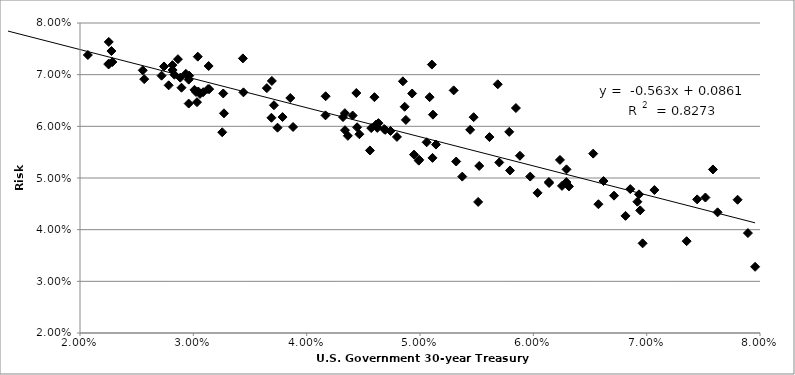
| Category | Series 0 |
|---|---|
| 0.07802062499999997 | 0.046 |
| 0.07893437499999999 | 0.039 |
| 0.07445446153846155 | 0.046 |
| 0.07518469696969694 | 0.046 |
| 0.07068396825396826 | 0.048 |
| 0.06855323076923074 | 0.048 |
| 0.06314272727272731 | 0.048 |
| 0.061389999999999986 | 0.049 |
| 0.06574515624999999 | 0.045 |
| 0.07352630769230767 | 0.038 |
| 0.07584772727272729 | 0.052 |
| 0.07956846153846153 | 0.033 |
| 0.0762572307692308 | 0.043 |
| 0.06942584615384617 | 0.044 |
| 0.06711861538461537 | 0.047 |
| 0.06234815384615382 | 0.053 |
| 0.06292569230769232 | 0.052 |
| 0.06918323076923079 | 0.045 |
| 0.06964469696969697 | 0.037 |
| 0.06619 | 0.049 |
| 0.06813328125000001 | 0.043 |
| 0.06932415384615384 | 0.047 |
| 0.06528166666666667 | 0.055 |
| 0.06137227272727274 | 0.049 |
| 0.05882015625000002 | 0.054 |
| 0.05846246153846155 | 0.064 |
| 0.05473196969696969 | 0.062 |
| 0.05104727272727275 | 0.072 |
| 0.05372968750000002 | 0.05 |
| 0.05794030769230768 | 0.051 |
| 0.060375606060606074 | 0.047 |
| 0.06252848484848486 | 0.048 |
| 0.06291261538461539 | 0.049 |
| 0.059723230769230765 | 0.05 |
| 0.05787187500000002 | 0.059 |
| 0.05686107692307691 | 0.068 |
| 0.054425937500000014 | 0.059 |
| 0.05699338461538464 | 0.053 |
| 0.05522562500000002 | 0.052 |
| 0.05297090909090909 | 0.067 |
| 0.0551321875 | 0.045 |
| 0.05612915384615385 | 0.058 |
| 0.0508485909090909 | 0.066 |
| 0.049307318181818195 | 0.066 |
| 0.048490953125 | 0.069 |
| 0.04597904615384617 | 0.066 |
| 0.051104863636363636 | 0.054 |
| 0.051142196969696976 | 0.062 |
| 0.048753138461538476 | 0.061 |
| 0.05319286153846153 | 0.053 |
| 0.05058801515151515 | 0.057 |
| 0.04864845454545455 | 0.064 |
| 0.046927312499999985 | 0.059 |
| 0.04465093846153847 | 0.058 |
| 0.044381742424242414 | 0.066 |
| 0.046829078125 | 0.059 |
| 0.04633183076923076 | 0.061 |
| 0.05140650769230769 | 0.056 |
| 0.0499256923076923 | 0.054 |
| 0.04739560000000001 | 0.059 |
| 0.047964107692307696 | 0.058 |
| 0.049891384615384615 | 0.053 |
| 0.04947043076923079 | 0.055 |
| 0.046137848484848476 | 0.06 |
| 0.044057984615384606 | 0.062 |
| 0.045697861538461525 | 0.06 |
| 0.04444857575757576 | 0.06 |
| 0.03648545454545455 | 0.067 |
| 0.034371828125000004 | 0.073 |
| 0.04167533846153845 | 0.066 |
| 0.043207924242424235 | 0.062 |
| 0.043369 | 0.063 |
| 0.04623328125000001 | 0.06 |
| 0.04363555384615385 | 0.058 |
| 0.03855463636363636 | 0.065 |
| 0.041662787878787896 | 0.062 |
| 0.04558379687499998 | 0.055 |
| 0.043380446153846154 | 0.059 |
| 0.03692825757575758 | 0.069 |
| 0.03039281538461539 | 0.073 |
| 0.03135133846153847 | 0.072 |
| 0.029340830769230764 | 0.07 |
| 0.02741293846153846 | 0.072 |
| 0.028642166666666666 | 0.073 |
| 0.031295609375 | 0.067 |
| 0.031398800000000004 | 0.067 |
| 0.0371136212121212 | 0.064 |
| 0.03787227272727271 | 0.062 |
| 0.03689290624999999 | 0.062 |
| 0.034420169230769224 | 0.067 |
| 0.032637651515151515 | 0.066 |
| 0.029634439393939404 | 0.07 |
| 0.025536187500000005 | 0.071 |
| 0.028846923076923076 | 0.069 |
| 0.029591227272727273 | 0.064 |
| 0.029592590909090898 | 0.069 |
| 0.0271972 | 0.07 |
| 0.025666046153846152 | 0.069 |
| 0.022773333333333333 | 0.075 |
| 0.028326507692307684 | 0.07 |
| 0.030435492307692304 | 0.067 |
| 0.02895535384615384 | 0.067 |
| 0.028157476923076918 | 0.072 |
| 0.028170630769230768 | 0.071 |
| 0.030233969230769233 | 0.067 |
| 0.030863630769230772 | 0.067 |
| 0.030584523076923074 | 0.066 |
| 0.03270189393939394 | 0.063 |
| 0.030102703124999998 | 0.067 |
| 0.027823599999999997 | 0.068 |
| 0.02285531818181818 | 0.072 |
| 0.02253839393939394 | 0.076 |
| 0.018880323076923073 | 0.078 |
| 0.013756846153846161 | 0.082 |
| 0.013650969696969693 | 0.079 |
| 0.016167287878787885 | 0.079 |
| 0.020693546875000003 | 0.074 |
| 0.02253638461538462 | 0.072 |
| 0.019311075757575756 | 0.073 |
| 0.01943701515151515 | 0.077 |
| 0.022523281249999996 | 0.072 |
| 0.030324123076923084 | 0.065 |
| 0.0325509393939394 | 0.059 |
| 0.03879798461538462 | 0.06 |
| 0.03742836923076922 | 0.06 |